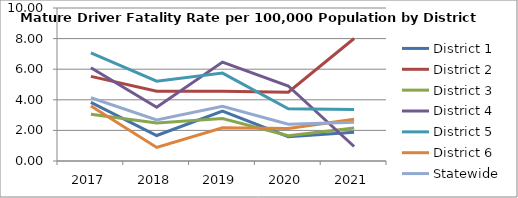
| Category | District 1 | District 2 | District 3 | District 4 | District 5 | District 6 | Statewide |
|---|---|---|---|---|---|---|---|
| 2017.0 | 3.832 | 5.529 | 3.058 | 6.1 | 7.065 | 3.601 | 4.135 |
| 2018.0 | 1.665 | 4.559 | 2.479 | 3.516 | 5.218 | 0.885 | 2.679 |
| 2019.0 | 3.254 | 4.555 | 2.783 | 6.467 | 5.748 | 2.175 | 3.581 |
| 2020.0 | 1.585 | 4.501 | 1.649 | 4.902 | 3.416 | 2.132 | 2.408 |
| 2021.0 | 1.884 | 8.006 | 2.163 | 0.948 | 3.37 | 2.735 | 2.525 |